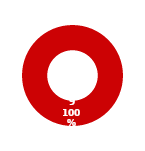
| Category | WORKFORCE |
|---|---|
| MIL 3 Complete | 0 |
| MIL 3 Not Complete | 9 |